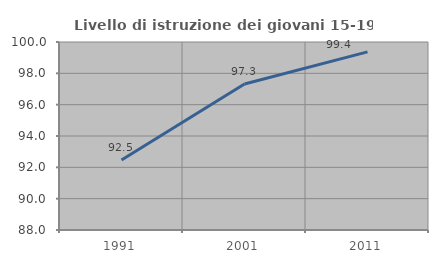
| Category | Livello di istruzione dei giovani 15-19 anni |
|---|---|
| 1991.0 | 92.469 |
| 2001.0 | 97.315 |
| 2011.0 | 99.367 |